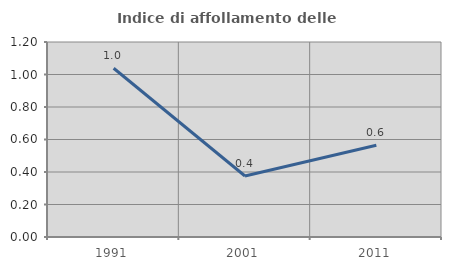
| Category | Indice di affollamento delle abitazioni  |
|---|---|
| 1991.0 | 1.038 |
| 2001.0 | 0.375 |
| 2011.0 | 0.564 |